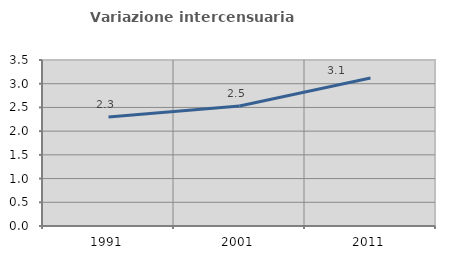
| Category | Variazione intercensuaria annua |
|---|---|
| 1991.0 | 2.299 |
| 2001.0 | 2.53 |
| 2011.0 | 3.121 |